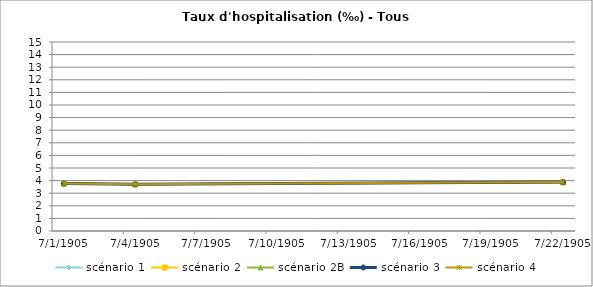
| Category | scénario 1 | scénario 2 | scénario 2B | scénario 3 | scénario 4 |
|---|---|---|---|---|---|
| 2009.0 | 3.762 | 3.762 | 3.762 | 3.762 | 3.762 |
| 2012.0 | 3.701 | 3.701 | 3.701 | 3.701 | 3.701 |
| 2030.0 | 3.884 | 3.846 | 3.884 | 3.884 | 3.884 |